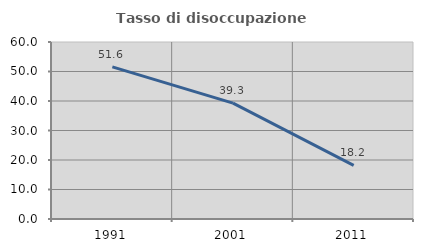
| Category | Tasso di disoccupazione giovanile  |
|---|---|
| 1991.0 | 51.562 |
| 2001.0 | 39.286 |
| 2011.0 | 18.182 |